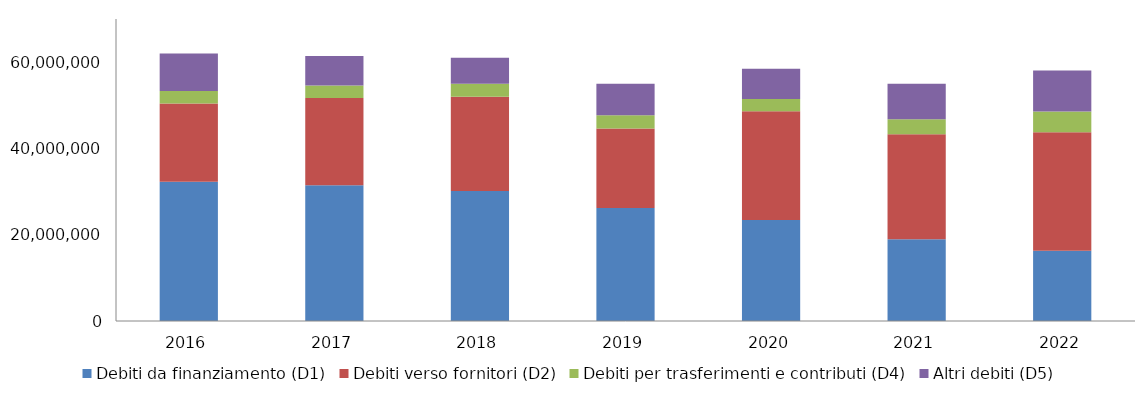
| Category | Debiti da finanziamento (D1) | Debiti verso fornitori (D2) | Debiti per trasferimenti e contributi (D4) | Altri debiti (D5) |
|---|---|---|---|---|
| 2016.0 | 32253080.3 | 18177317.76 | 2897067.2 | 8652865.56 |
| 2017.0 | 31439560.33 | 20244444.81 | 2924184.8 | 6788991.01 |
| 2018.0 | 30113038.13 | 21854213.62 | 3018624.09 | 6006030.43 |
| 2019.0 | 26212373.98 | 18421858.88 | 3055321.03 | 7286593.76 |
| 2020.0 | 23395799 | 25220349.09 | 2862227.5 | 6969096.88 |
| 2021.0 | 18969392.01 | 24295434.15 | 3497206.83 | 8200908.82 |
| 2022.0 | 16261071.48 | 27481795.9 | 4816267.87 | 9485178.76 |